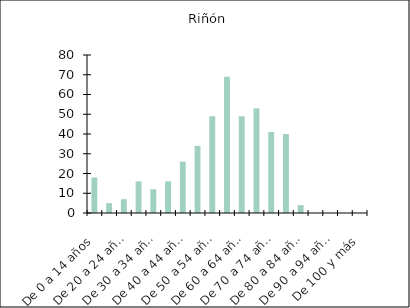
| Category | Riñón |
|---|---|
| De 0 a 14 años | 18 |
| De 15 a 19 años | 5 |
| De 20 a 24 años | 7 |
| De 25 a 29 años | 16 |
| De 30 a 34 años | 12 |
| De 35 a 39 años | 16 |
| De 40 a 44 años | 26 |
| De 45 a 49 años | 34 |
| De 50 a 54 años | 49 |
| De 55 a 59 años | 69 |
| De 60 a 64 años | 49 |
| De 65 a 69 años | 53 |
| De 70 a 74 años | 41 |
| De 75 a 79 años | 40 |
| De 80 a 84 años | 4 |
| De 85 a 89 años | 0 |
| De 90 a 94 años | 0 |
| De 95 a 99 años | 0 |
| De 100 y más | 0 |